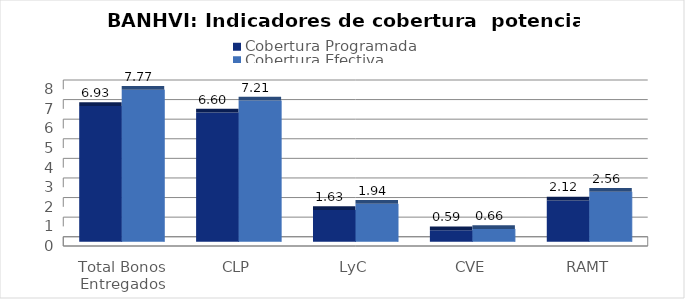
| Category | Cobertura Programada | Cobertura Efectiva |
|---|---|---|
| Total Bonos Entregados | 6.934 | 7.769 |
| CLP | 6.601 | 7.211 |
| LyC | 1.63 | 1.942 |
| CVE | 0.591 | 0.658 |
| RAMT | 2.116 | 2.558 |